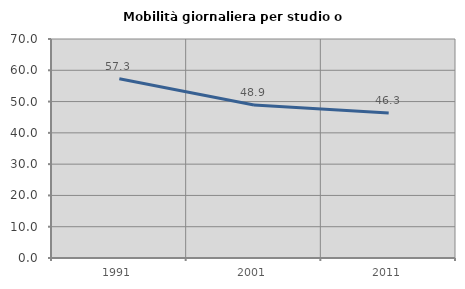
| Category | Mobilità giornaliera per studio o lavoro |
|---|---|
| 1991.0 | 57.289 |
| 2001.0 | 48.889 |
| 2011.0 | 46.31 |